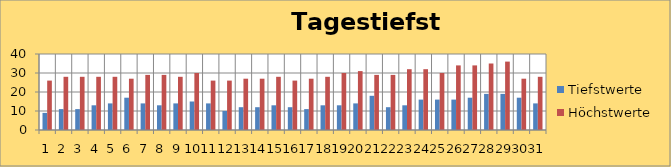
| Category | Tiefstwerte | Höchstwerte |
|---|---|---|
| 0 | 9 | 26 |
| 1 | 11 | 28 |
| 2 | 11 | 28 |
| 3 | 13 | 28 |
| 4 | 14 | 28 |
| 5 | 17 | 27 |
| 6 | 14 | 29 |
| 7 | 13 | 29 |
| 8 | 14 | 28 |
| 9 | 15 | 30 |
| 10 | 14 | 26 |
| 11 | 10 | 26 |
| 12 | 12 | 27 |
| 13 | 12 | 27 |
| 14 | 13 | 28 |
| 15 | 12 | 26 |
| 16 | 11 | 27 |
| 17 | 13 | 28 |
| 18 | 13 | 30 |
| 19 | 14 | 31 |
| 20 | 18 | 29 |
| 21 | 12 | 29 |
| 22 | 13 | 32 |
| 23 | 16 | 32 |
| 24 | 16 | 30 |
| 25 | 16 | 34 |
| 26 | 17 | 34 |
| 27 | 19 | 35 |
| 28 | 19 | 36 |
| 29 | 17 | 27 |
| 30 | 14 | 28 |